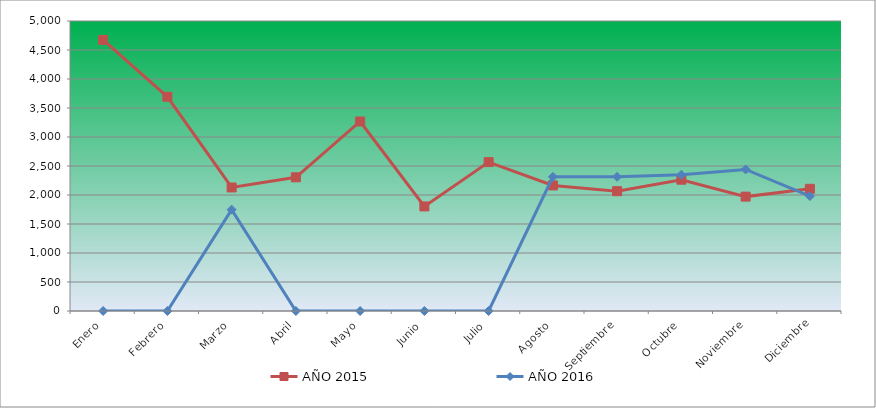
| Category | AÑO 2015 | AÑO 2016 |
|---|---|---|
| Enero | 4673.822 | 0 |
| Febrero | 3693.545 | 0 |
| Marzo | 2129.769 | 1747.612 |
| Abril | 2304.818 | 0 |
| Mayo | 3267.591 | 0 |
| Junio | 1803.01 | 0 |
| Julio | 2567.393 | 0 |
| Agosto | 2164.779 | 2312.673 |
| Septiembre | 2065.584 | 2312.673 |
| Octubre | 2263.974 | 2347.625 |
| Noviembre | 1972.224 | 2440.831 |
| Diciembre | 2106.429 | 1980.627 |